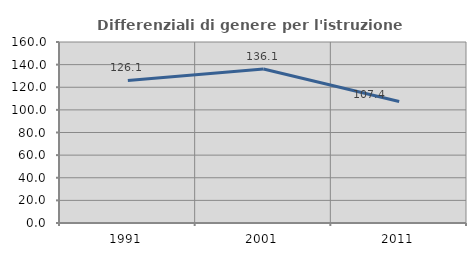
| Category | Differenziali di genere per l'istruzione superiore |
|---|---|
| 1991.0 | 126.064 |
| 2001.0 | 136.107 |
| 2011.0 | 107.387 |